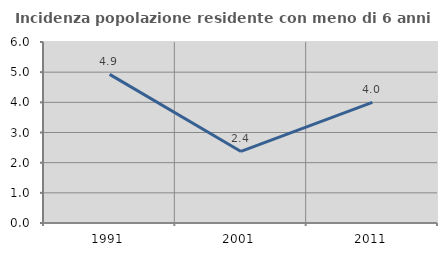
| Category | Incidenza popolazione residente con meno di 6 anni |
|---|---|
| 1991.0 | 4.926 |
| 2001.0 | 2.372 |
| 2011.0 | 4 |